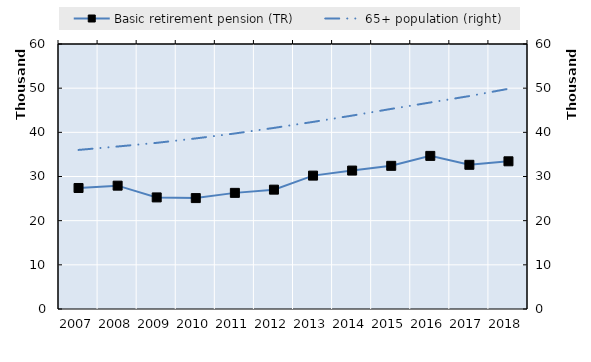
| Category | Basic retirement pension (TR) | Series 4 | Series 5 | Series 6 | Series 7 | Series 8 | Series 9 | Series 10 | Series 11 | Series 12 | Series 13 | Series 14 | Series 15 | Series 16 | Series 17 | Series 18 | Series 19 |
|---|---|---|---|---|---|---|---|---|---|---|---|---|---|---|---|---|---|
| 2007.0 | 27397 |  |  |  |  |  |  |  |  |  |  |  |  |  |  |  |  |
| 2008.0 | 27925 |  |  |  |  |  |  |  |  |  |  |  |  |  |  |  |  |
| 2009.0 | 25266 |  |  |  |  |  |  |  |  |  |  |  |  |  |  |  |  |
| 2010.0 | 25113 |  |  |  |  |  |  |  |  |  |  |  |  |  |  |  |  |
| 2011.0 | 26293 |  |  |  |  |  |  |  |  |  |  |  |  |  |  |  |  |
| 2012.0 | 27023 |  |  |  |  |  |  |  |  |  |  |  |  |  |  |  |  |
| 2013.0 | 30201 |  |  |  |  |  |  |  |  |  |  |  |  |  |  |  |  |
| 2014.0 | 31342 |  |  |  |  |  |  |  |  |  |  |  |  |  |  |  |  |
| 2015.0 | 32415 |  |  |  |  |  |  |  |  |  |  |  |  |  |  |  |  |
| 2016.0 | 34666 |  |  |  |  |  |  |  |  |  |  |  |  |  |  |  |  |
| 2017.0 | 32649 |  |  |  |  |  |  |  |  |  |  |  |  |  |  |  |  |
| 2018.0 | 33440 |  |  |  |  |  |  |  |  |  |  |  |  |  |  |  |  |